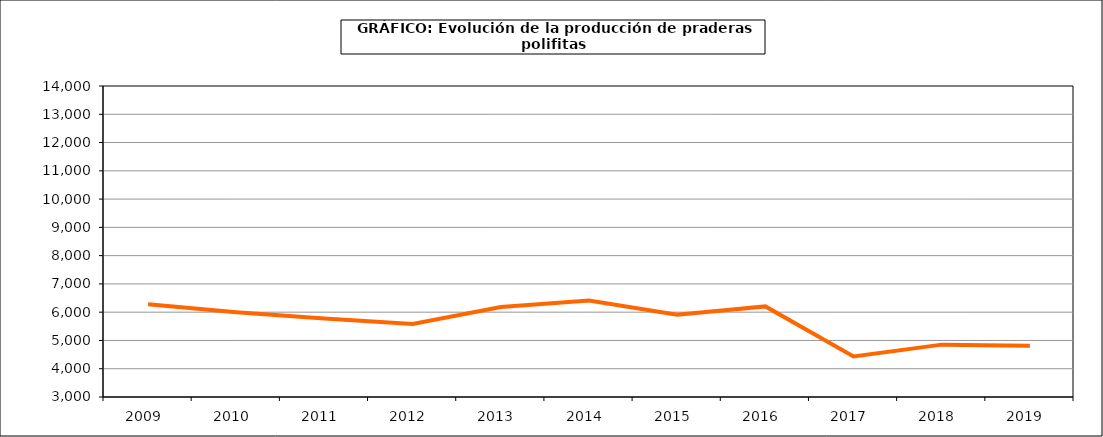
| Category | Producción |
|---|---|
| 2009.0 | 6281.816 |
| 2010.0 | 5997.652 |
| 2011.0 | 5773.366 |
| 2012.0 | 5584.28 |
| 2013.0 | 6180.164 |
| 2014.0 | 6413.135 |
| 2015.0 | 5907.876 |
| 2016.0 | 6204.083 |
| 2017.0 | 4432.964 |
| 2018.0 | 4851.915 |
| 2019.0 | 4814.376 |